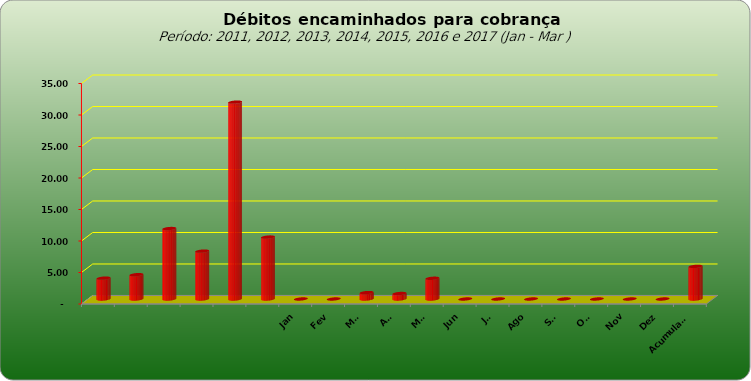
| Category |  3.309.443,02  |
|---|---|
|  | 3309443.02 |
|  | 3859728.44 |
|  | 11181928.25 |
|  | 7600526.01 |
|  | 31248623.5 |
|  | 9830198.34 |
| Jan | 0 |
| Fev | 0 |
| Mar | 1019401.01 |
| Abr | 870947.61 |
| Mai | 3287717.74 |
| Jun | 0 |
| Jul | 0 |
| Ago | 0 |
| Set | 0 |
| Out | 0 |
| Nov | 0 |
| Dez | 0 |
| Acumulado | 5178066.36 |